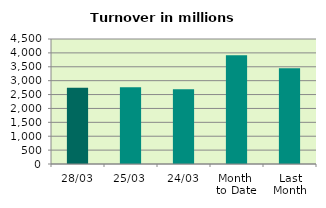
| Category | Series 0 |
|---|---|
| 28/03 | 2749.246 |
| 25/03 | 2762.89 |
| 24/03 | 2693.626 |
| Month 
to Date | 3912.479 |
| Last
Month | 3445.759 |